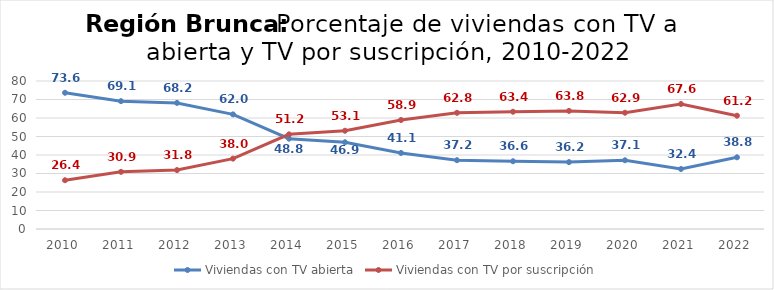
| Category | Viviendas con TV abierta | Viviendas con TV por suscripción |
|---|---|---|
| 2010.0 | 73.645 | 26.355 |
| 2011.0 | 69.111 | 30.889 |
| 2012.0 | 68.152 | 31.848 |
| 2013.0 | 61.967 | 38.033 |
| 2014.0 | 48.827 | 51.173 |
| 2015.0 | 46.884 | 53.116 |
| 2016.0 | 41.089 | 58.911 |
| 2017.0 | 37.189 | 62.811 |
| 2018.0 | 36.615 | 63.385 |
| 2019.0 | 36.162 | 63.838 |
| 2020.0 | 37.147 | 62.853 |
| 2021.0 | 32.435 | 67.565 |
| 2022.0 | 38.767 | 61.233 |